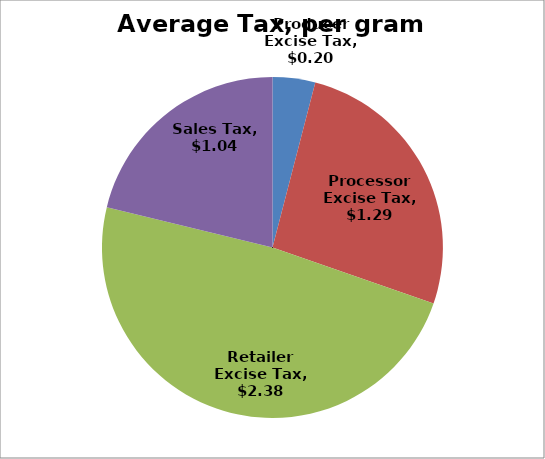
| Category | Tax Summary, per gram grown |
|---|---|
| Producer Excise Tax | 0.199 |
| Processor Excise Tax | 1.293 |
| Retailer Excise Tax | 2.385 |
| Sales Tax | 1.043 |